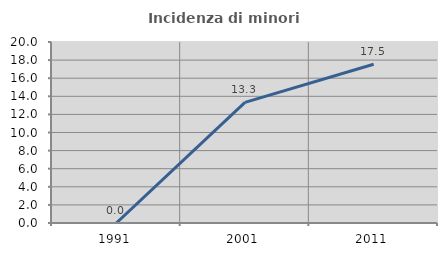
| Category | Incidenza di minori stranieri |
|---|---|
| 1991.0 | 0 |
| 2001.0 | 13.333 |
| 2011.0 | 17.544 |